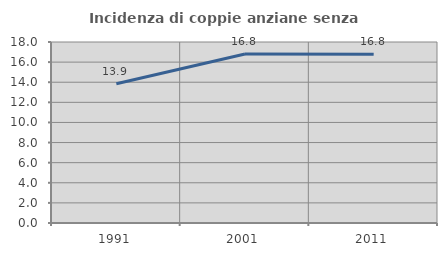
| Category | Incidenza di coppie anziane senza figli  |
|---|---|
| 1991.0 | 13.85 |
| 2001.0 | 16.809 |
| 2011.0 | 16.793 |